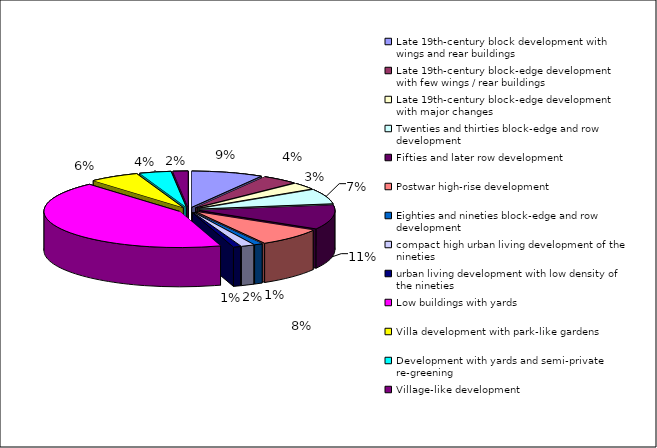
| Category | Series 0 |
|---|---|
| Late 19th-century block development with wings and rear buildings | 8.574 |
| Late 19th-century block-edge development with few wings / rear buildings | 4.408 |
| Late 19th-century block-edge development with major changes | 3.092 |
| Twenties and thirties block-edge and row development | 6.595 |
| Fifties and later row development | 10.811 |
| Postwar high-rise development | 8.125 |
| Eighties and nineties block-edge and row development | 1.008 |
| compact high urban living development of the nineties | 1.594 |
| urban living development with low density of the nineties | 0.893 |
| Low buildings with yards | 43.33 |
| Villa development with park-like gardens | 5.977 |
| Development with yards and semi-private re-greening | 3.79 |
| Village-like development | 1.804 |